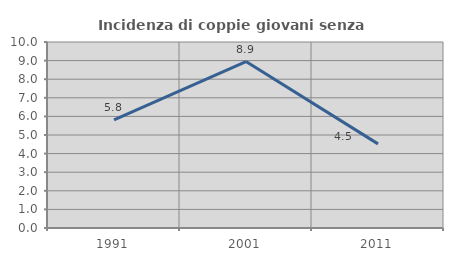
| Category | Incidenza di coppie giovani senza figli |
|---|---|
| 1991.0 | 5.813 |
| 2001.0 | 8.947 |
| 2011.0 | 4.523 |